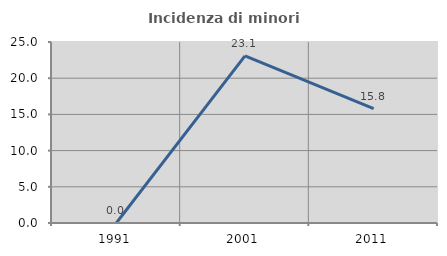
| Category | Incidenza di minori stranieri |
|---|---|
| 1991.0 | 0 |
| 2001.0 | 23.077 |
| 2011.0 | 15.789 |